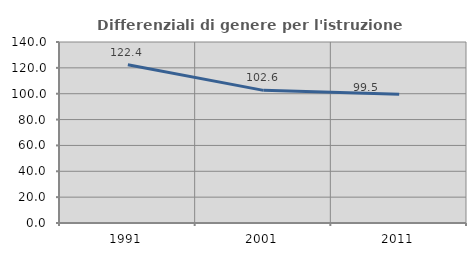
| Category | Differenziali di genere per l'istruzione superiore |
|---|---|
| 1991.0 | 122.394 |
| 2001.0 | 102.601 |
| 2011.0 | 99.541 |